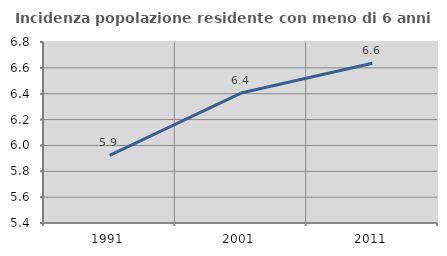
| Category | Incidenza popolazione residente con meno di 6 anni |
|---|---|
| 1991.0 | 5.924 |
| 2001.0 | 6.405 |
| 2011.0 | 6.635 |